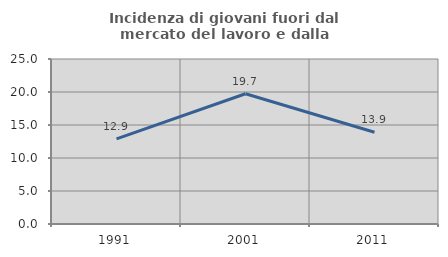
| Category | Incidenza di giovani fuori dal mercato del lavoro e dalla formazione  |
|---|---|
| 1991.0 | 12.892 |
| 2001.0 | 19.737 |
| 2011.0 | 13.901 |